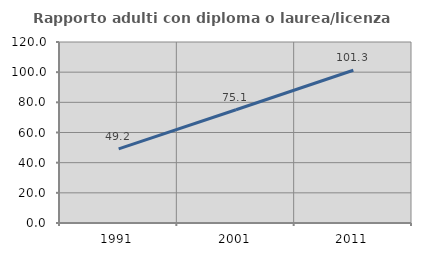
| Category | Rapporto adulti con diploma o laurea/licenza media  |
|---|---|
| 1991.0 | 49.174 |
| 2001.0 | 75.063 |
| 2011.0 | 101.262 |